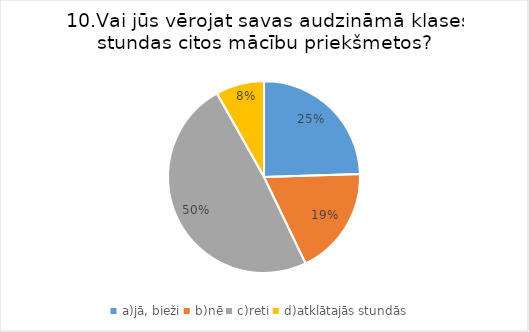
| Category | Series 0 |
|---|---|
| a)jā, bieži | 0.25 |
| b)nē | 0.188 |
| c)reti | 0.5 |
| d)atklātajās stundās | 0.083 |